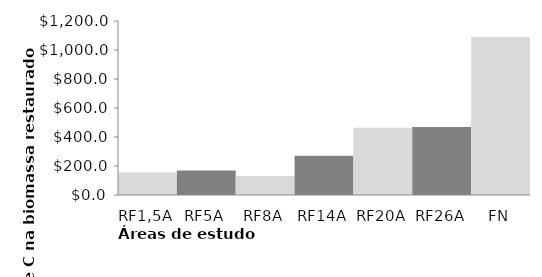
| Category | Series 0 |
|---|---|
| RF1,5A | 154.929 |
| RF5A | 168.753 |
| RF8A | 131.863 |
| RF14A | 270.008 |
| RF20A | 463.326 |
| RF26A | 469.767 |
| FN | 1088.404 |